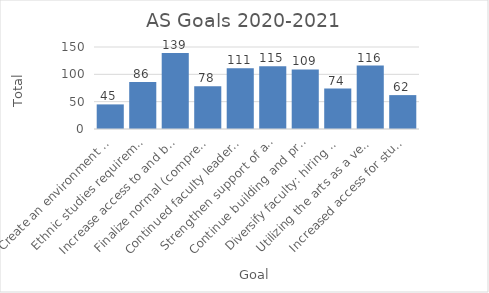
| Category | Series 0 |
|---|---|
| Create an environment and culture that is infused with social justice & anti-racism in every aspect of the institution, rooted in accountability, and reflected in its Mission, Vision, & Values statementsa.     Statement of solidarity of BLMb.     Develop c | 45 |
| Ethnic studies requirement for all degrees | 86 |
| Increase access to and be more welcoming to faculty at Academic Senate and Standing Committees | 139 |
| Finalize normal (compressed) calendar discussions within the VCCCD | 78 |
| Continued faculty leadership in the implementation of Guided Pathways, including success teams | 111 |
| Strengthen support of adjunct faculty within the Academic Senate’s academic and professional purview a.     For example, years of service recognition | 115 |
| Continue building and practicing integrated processes for planning and budgets focused on increased transparency and input from all constituentsa.     Foster a transparent and informative relationship between faculty, classified, and management. | 109 |
| Diversify faculty: hiring and retention | 74 |
| Utilizing the arts as a vehicle to facilitate college goals such as open, safe spaces, dialog, social justice and equity, student access, and student success | 116 |
| Increased access for studentsa.     Encourage consideration of Open Educational Resources (OER) and Zero Textbook Cost (ZTC), Low Textbook Cost (LTC) | 62 |